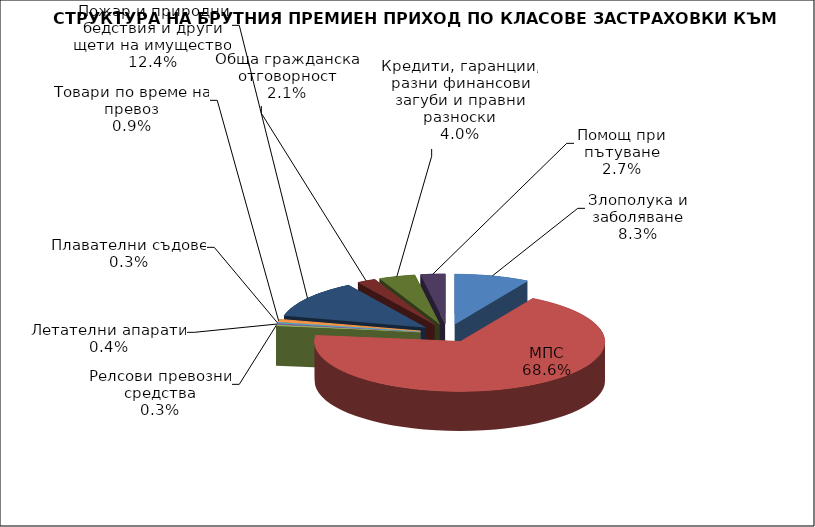
| Category | Злополука и заболяване |
|---|---|
| Злополука и заболяване | 0.083 |
| МПС | 0.686 |
| Релсови превозни средства | 0.003 |
| Летателни апарати | 0.004 |
| Плавателни съдове | 0.003 |
| Товари по време на превоз | 0.009 |
| Пожар и природни бедствия и други щети на имущество | 0.124 |
| Обща гражданска отговорност | 0.021 |
| Кредити, гаранции, разни финансови загуби и правни разноски | 0.04 |
| Помощ при пътуване | 0.027 |